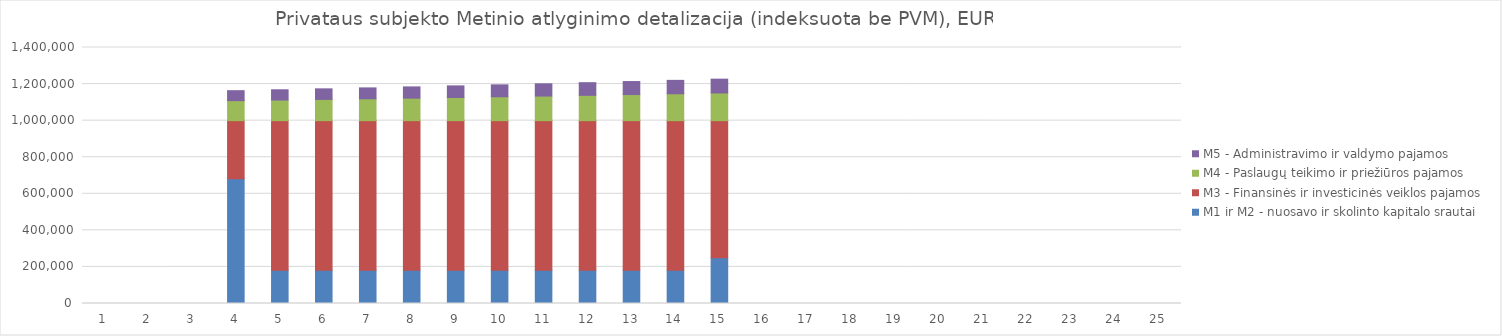
| Category | M1 ir M2 - nuosavo ir skolinto kapitalo srautai | M3 - Finansinės ir investicinės veiklos pajamos | M4 - Paslaugų teikimo ir priežiūros pajamos | M5 - Administravimo ir valdymo pajamos |
|---|---|---|---|---|
| 1.0 | 0 | 0 | 0 | 0 |
| 2.0 | 0 | 0 | 0 | 0 |
| 3.0 | 0 | 0 | 0 | 0 |
| 4.0 | 681818 | 318182 | 109273 | 54636 |
| 5.0 | 181818 | 818182 | 112551 | 56275 |
| 6.0 | 181818 | 818182 | 115927 | 57964 |
| 7.0 | 181818 | 818182 | 119405 | 59703 |
| 8.0 | 181818 | 818182 | 122987 | 61494 |
| 9.0 | 181818 | 818182 | 126677 | 63339 |
| 10.0 | 181818 | 818182 | 130477 | 65239 |
| 11.0 | 181818 | 818182 | 134392 | 67196 |
| 12.0 | 181818 | 818182 | 138423 | 69212 |
| 13.0 | 181818 | 818182 | 142576 | 71288 |
| 14.0 | 181818 | 818182 | 146853 | 73427 |
| 15.0 | 250000 | 750000 | 151259 | 75629 |
| 16.0 | 0 | 0 | 0 | 0 |
| 17.0 | 0 | 0 | 0 | 0 |
| 18.0 | 0 | 0 | 0 | 0 |
| 19.0 | 0 | 0 | 0 | 0 |
| 20.0 | 0 | 0 | 0 | 0 |
| 21.0 | 0 | 0 | 0 | 0 |
| 22.0 | 0 | 0 | 0 | 0 |
| 23.0 | 0 | 0 | 0 | 0 |
| 24.0 | 0 | 0 | 0 | 0 |
| 25.0 | 0 | 0 | 0 | 0 |